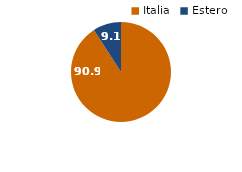
| Category | 2020 |
|---|---|
| Italia | 90.9 |
| Estero | 9.1 |